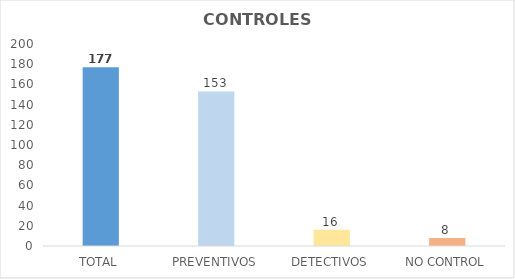
| Category | Series 0 |
|---|---|
| TOTAL | 177 |
| PREVENTIVOS | 153 |
| DETECTIVOS | 16 |
| NO CONTROL | 8 |